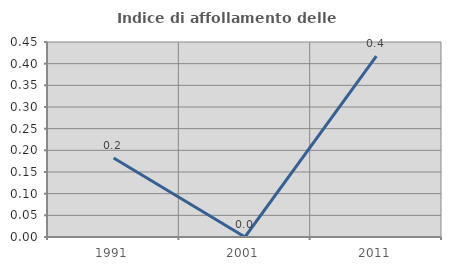
| Category | Indice di affollamento delle abitazioni  |
|---|---|
| 1991.0 | 0.182 |
| 2001.0 | 0 |
| 2011.0 | 0.417 |